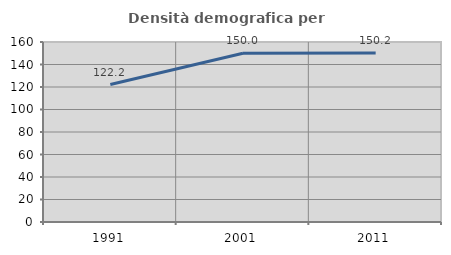
| Category | Densità demografica |
|---|---|
| 1991.0 | 122.164 |
| 2001.0 | 150.004 |
| 2011.0 | 150.203 |